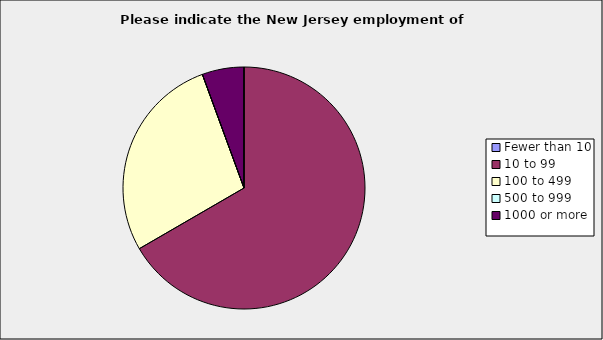
| Category | Series 0 |
|---|---|
| Fewer than 10 | 0 |
| 10 to 99 | 0.667 |
| 100 to 499 | 0.278 |
| 500 to 999 | 0 |
| 1000 or more | 0.056 |